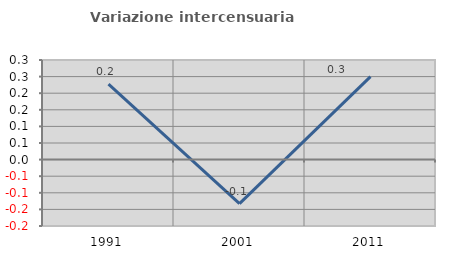
| Category | Variazione intercensuaria annua |
|---|---|
| 1991.0 | 0.227 |
| 2001.0 | -0.132 |
| 2011.0 | 0.25 |